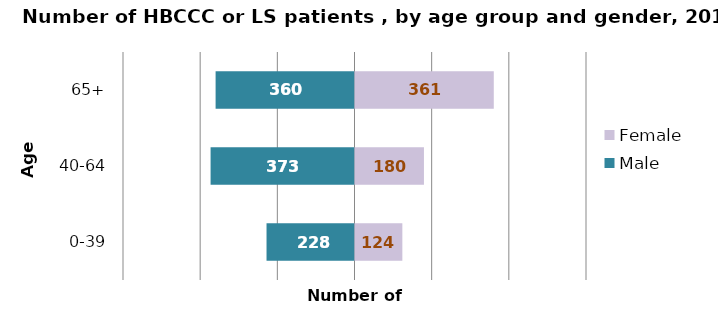
| Category | Male | Female |
|---|---|---|
| 0-39 | 228 | -124 |
| 40-64 | 373 | -180 |
| 65+ | 360 | -361 |